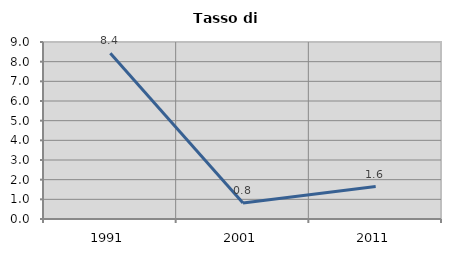
| Category | Tasso di disoccupazione   |
|---|---|
| 1991.0 | 8.428 |
| 2001.0 | 0.811 |
| 2011.0 | 1.647 |